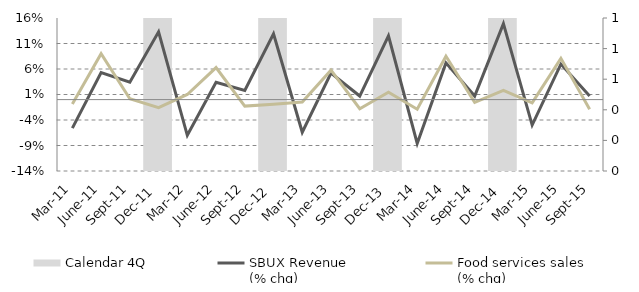
| Category | Calendar 4Q |
|---|---|
| 0 | 0 |
| 1 | 0 |
| 2 | 0 |
| 3 | 1 |
| 4 | 0 |
| 5 | 0 |
| 6 | 0 |
| 7 | 1 |
| 8 | 0 |
| 9 | 0 |
| 10 | 0 |
| 11 | 1 |
| 12 | 0 |
| 13 | 0 |
| 14 | 0 |
| 15 | 1 |
| 16 | 0 |
| 17 | 0 |
| 18 | 0 |